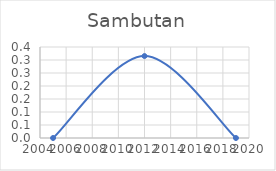
| Category | Series 0 |
|---|---|
| 2005.0 | 0 |
| 2012.0 | 0.315 |
| 2019.0 | 0 |